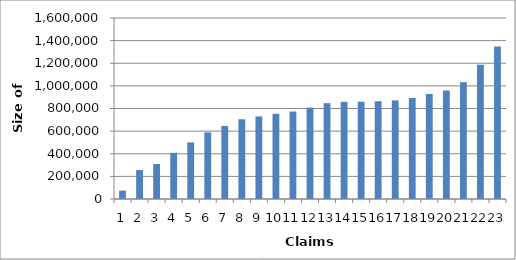
| Category | Series 0 |
|---|---|
| 0 | 73677.5 |
| 1 | 255872.5 |
| 2 | 309790 |
| 3 | 408070 |
| 4 | 500532.5 |
| 5 | 588575 |
| 6 | 646130 |
| 7 | 704957.5 |
| 8 | 729917.5 |
| 9 | 753460 |
| 10 | 773370 |
| 11 | 807430 |
| 12 | 847015 |
| 13 | 858975 |
| 14 | 859657.5 |
| 15 | 863850 |
| 16 | 871390 |
| 17 | 893262.5 |
| 18 | 928687.5 |
| 19 | 958912.5 |
| 20 | 1032752.5 |
| 21 | 1186445 |
| 22 | 1347872.5 |